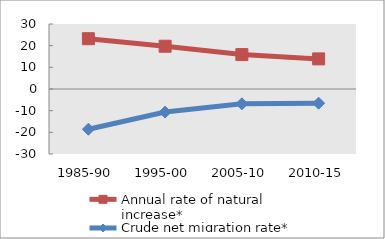
| Category | Annual rate of natural increase* | Crude net migration rate* |
|---|---|---|
| 1985-90 | 23.208 | -18.576 |
| 1995-00 | 19.737 | -10.65 |
| 2005-10 | 15.883 | -6.834 |
| 2010-15 | 13.891 | -6.552 |